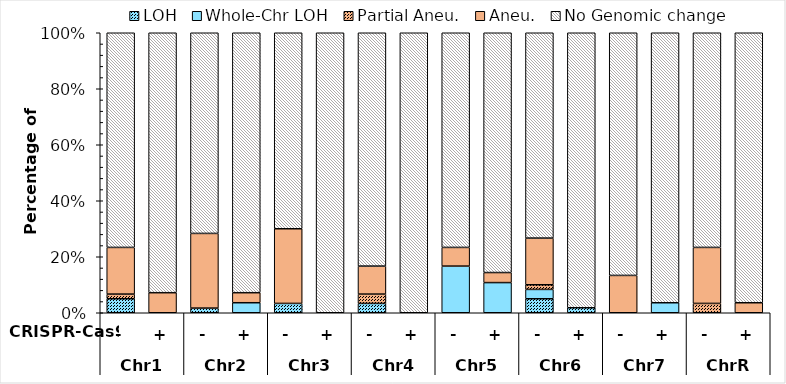
| Category | LOH | Whole-Chr LOH | Partial Aneu. | Aneu. | No Genomic change |
|---|---|---|---|---|---|
| 0 | 5 | 0 | 1.667 | 16.667 | 76.667 |
| 1 | 0 | 0 | 0 | 7.143 | 92.593 |
| 2 | 1.667 | 0 | 0 | 26.667 | 71.667 |
| 3 | 0 | 3.571 | 0 | 3.571 | 92.593 |
| 4 | 3.333 | 0 | 0 | 26.667 | 70 |
| 5 | 0 | 0 | 0 | 0 | 100 |
| 6 | 3.333 | 0 | 3.333 | 10 | 83.333 |
| 7 | 0 | 0 | 0 | 0 | 100 |
| 8 | 0 | 16.667 | 0 | 6.667 | 76.667 |
| 9 | 0 | 10.714 | 0 | 3.571 | 85.185 |
| 10 | 5 | 3.333 | 1.667 | 16.667 | 73.333 |
| 11 | 1.786 | 0 | 0 | 0 | 98.148 |
| 12 | 0 | 0 | 0 | 13.333 | 86.667 |
| 13 | 0 | 3.571 | 0 | 0 | 96.296 |
| 14 | 0 | 0 | 3.333 | 20 | 76.667 |
| 15 | 0 | 0 | 0 | 3.571 | 96.296 |